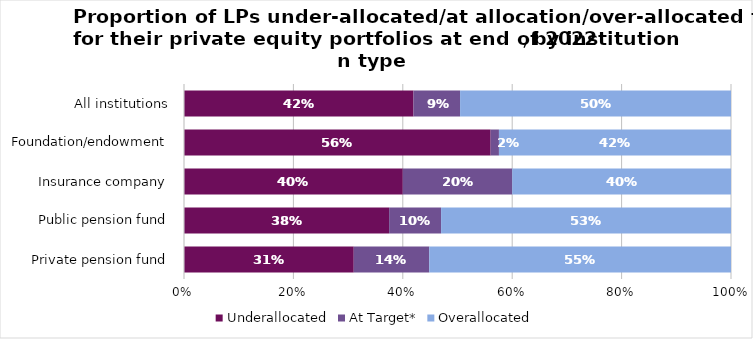
| Category | Underallocated | At Target* | Overallocated |
|---|---|---|---|
| Private pension fund | 0.31 | 0.138 | 0.552 |
| Public pension fund | 0.375 | 0.095 | 0.53 |
| Insurance company | 0.4 | 0.2 | 0.4 |
| Foundation/endowment | 0.561 | 0.015 | 0.424 |
| All institutions | 0.42 | 0.085 | 0.495 |